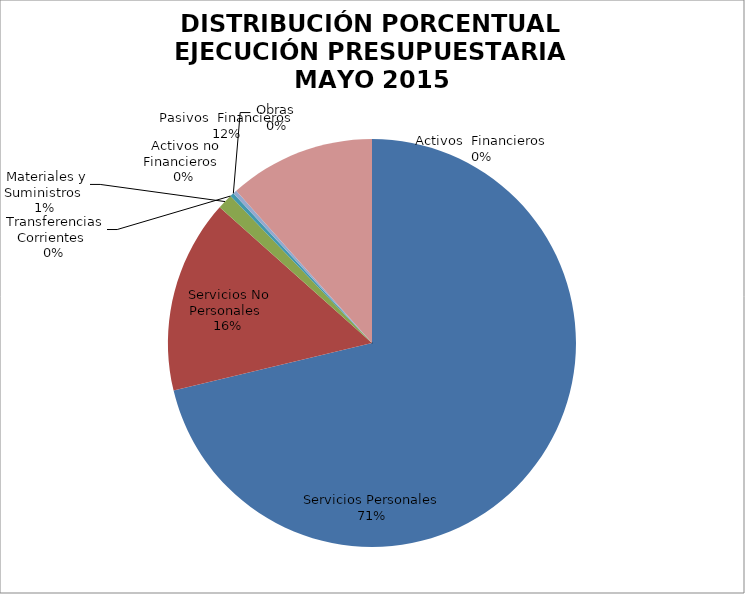
| Category | Series 0 | Series 1 |
|---|---|---|
| Servicios Personales | 10903094.91 | 0.928 |
| Servicios No Personales | 2342934.99 | 0.199 |
| Materiales y Suministros | 187152.82 | 0.016 |
| Transferencias Corrientes | 0 | 0 |
| Activos no Financieros | 46271.34 | 0.004 |
| Obras | 0 | 0 |
| Activos  Financieros | 46943.9 | 0.004 |
| Pasivos  Financieros | -1772700.41 | -0.151 |